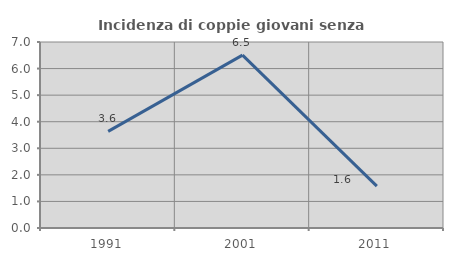
| Category | Incidenza di coppie giovani senza figli |
|---|---|
| 1991.0 | 3.636 |
| 2001.0 | 6.504 |
| 2011.0 | 1.575 |